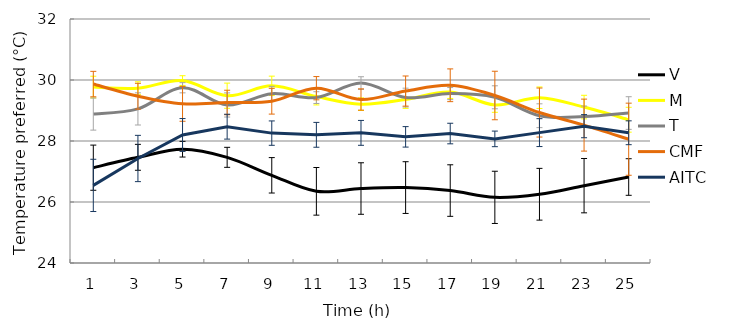
| Category | V | M | T | CMF | AITC |
|---|---|---|---|---|---|
| 1.0 | 27.125 | 29.767 | 28.883 | 29.867 | 26.544 |
| 3.0 | 27.465 | 29.732 | 29.052 | 29.468 | 27.427 |
| 5.0 | 27.731 | 29.981 | 29.746 | 29.219 | 28.197 |
| 7.0 | 27.465 | 29.485 | 29.181 | 29.262 | 28.469 |
| 9.0 | 26.875 | 29.808 | 29.552 | 29.304 | 28.258 |
| 11.0 | 26.35 | 29.458 | 29.423 | 29.731 | 28.203 |
| 13.0 | 26.442 | 29.208 | 29.9 | 29.36 | 28.267 |
| 15.0 | 26.473 | 29.36 | 29.423 | 29.638 | 28.136 |
| 17.0 | 26.375 | 29.604 | 29.554 | 29.827 | 28.244 |
| 19.0 | 26.152 | 29.183 | 29.433 | 29.492 | 28.069 |
| 21.0 | 26.254 | 29.419 | 28.829 | 28.933 | 28.275 |
| 23.0 | 26.535 | 29.112 | 28.8 | 28.521 | 28.486 |
| 25.0 | 26.819 | 28.697 | 28.917 | 28.058 | 28.27 |